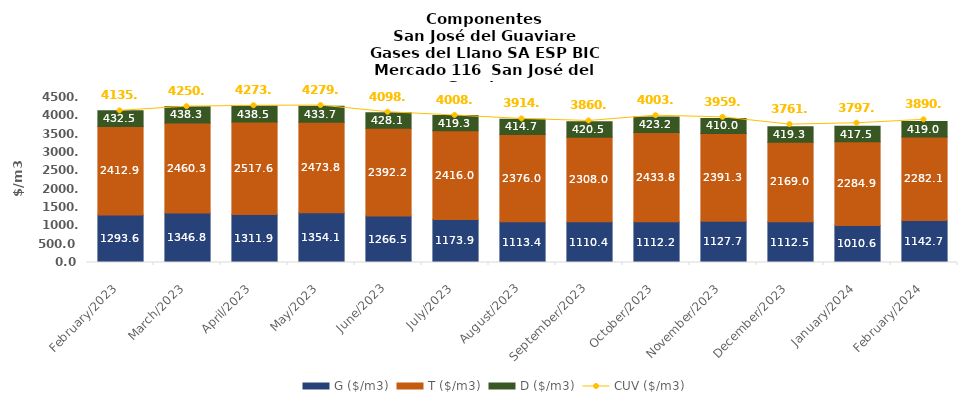
| Category | G ($/m3) | T ($/m3) | D ($/m3) |
|---|---|---|---|
| 2023-02-01 | 1293.59 | 2412.88 | 432.47 |
| 2023-03-01 | 1346.83 | 2460.32 | 438.26 |
| 2023-04-01 | 1311.89 | 2517.58 | 438.54 |
| 2023-05-01 | 1354.14 | 2473.76 | 433.72 |
| 2023-06-01 | 1266.52 | 2392.24 | 428.13 |
| 2023-07-01 | 1173.91 | 2415.98 | 419.29 |
| 2023-08-01 | 1113.38 | 2375.96 | 414.65 |
| 2023-09-01 | 1110.42 | 2307.98 | 420.53 |
| 2023-10-01 | 1112.24 | 2433.8 | 423.16 |
| 2023-11-01 | 1127.7 | 2391.33 | 410 |
| 2023-12-01 | 1112.49 | 2169.04 | 419.27 |
| 2024-01-01 | 1010.63 | 2284.85 | 417.54 |
| 2024-02-01 | 1142.71 | 2282.13 | 419.04 |